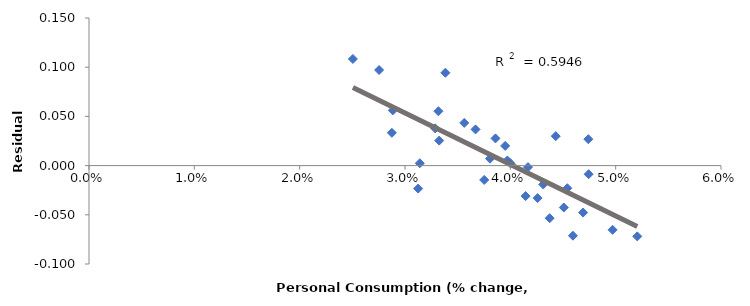
| Category | Series 0 |
|---|---|
| 0.038072990307575605 | 0.007 |
| 0.032863754876003126 | 0.038 |
| 0.039509495736710365 | 0.02 |
| 0.04431054230367004 | 0.03 |
| 0.04740519947097277 | 0.027 |
| 0.04743361446490413 | -0.009 |
| 0.03971788802473308 | 0.005 |
| 0.04167699849314288 | -0.002 |
| 0.03324506930767712 | 0.025 |
| 0.028845255665365332 | 0.056 |
| 0.03383325899494505 | 0.094 |
| 0.02753973485680805 | 0.097 |
| 0.025052668058988203 | 0.108 |
| 0.02875379056127536 | 0.033 |
| 0.03140476554284222 | 0.002 |
| 0.031247772471309387 | -0.023 |
| 0.04594469554076652 | -0.071 |
| 0.052052352416842584 | -0.072 |
| 0.049707627820236855 | -0.065 |
| 0.04507555793639151 | -0.043 |
| 0.04259101735284121 | -0.033 |
| 0.038588337933175065 | 0.028 |
| 0.0331742144369267 | 0.055 |
| 0.035624524620523124 | 0.043 |
| 0.03669829562606575 | 0.037 |
| 0.037518072483785136 | -0.015 |
| 0.04373608890245961 | -0.053 |
| 0.0469085538658045 | -0.048 |
| 0.04145122575060012 | -0.031 |
| 0.04000716220845146 | 0.002 |
| 0.04540625433045409 | -0.023 |
| 0.04312152568609351 | -0.019 |